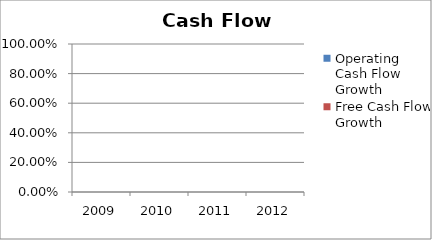
| Category | Operating Cash Flow Growth | Free Cash Flow Growth |
|---|---|---|
| 2009.0 |  | 0 |
| 2010.0 |  | 0 |
| 2011.0 |  | 0 |
| 2012.0 |  | 0 |